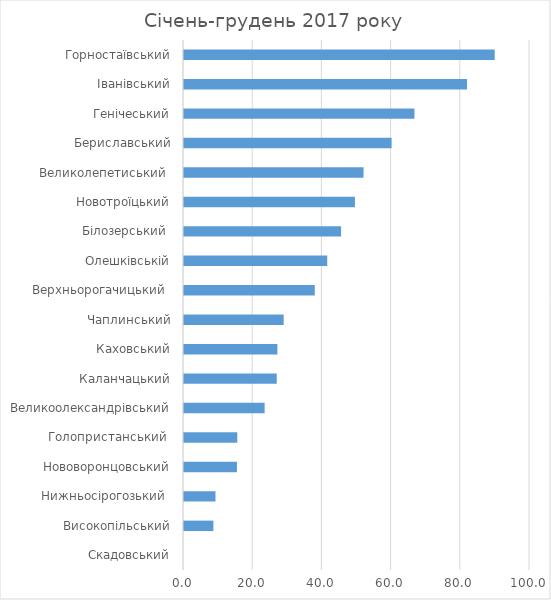
| Category | Series 0 |
|---|---|
| Скадовський | 0 |
| Високопільський | 8.5 |
| Нижньосірогозький  | 9.1 |
| Нововоронцовський | 15.3 |
| Голопристанський  | 15.4 |
| Великоолександрівський | 23.3 |
| Каланчацький | 26.8 |
| Каховський | 27 |
| Чаплинський | 28.8 |
| Верхньорогачицький  | 37.8 |
| Олешківській | 41.4 |
| Білозерський  | 45.4 |
| Новотроїцький | 49.4 |
| Великолепетиський  | 51.9 |
| Бериславський | 60 |
| Генічеський | 66.6 |
| Іванівський | 81.8 |
| Горностаївський | 89.8 |